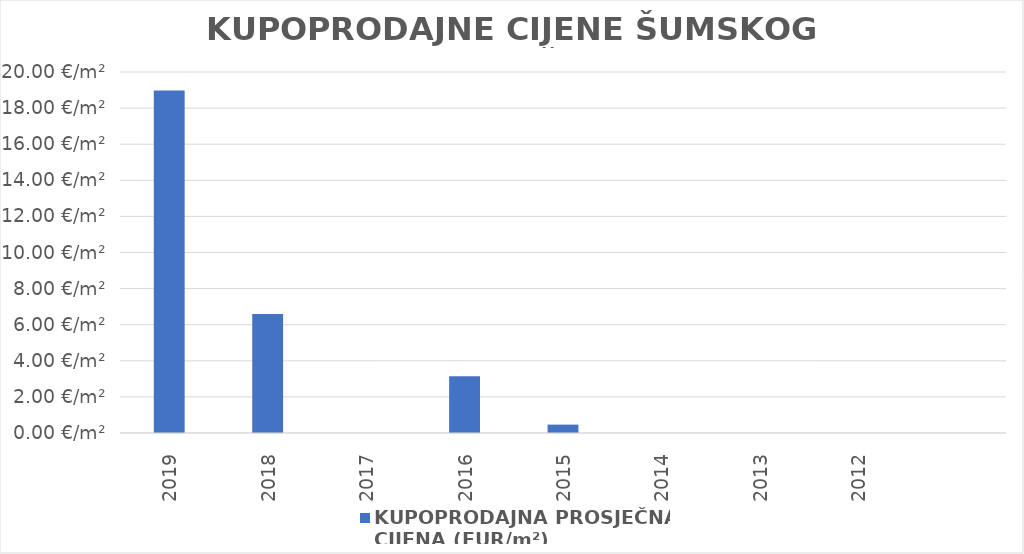
| Category | KUPOPRODAJNA PROSJEČNA 
CIJENA (EUR/m²) |
|---|---|
| 2019 | 1900-01-18 23:16:41 |
| 2018 | 1900-01-06 14:10:46 |
| 2017 | 0 |
| 2016 | 1900-01-03 03:19:32 |
| 2015 | 0.464 |
| 2014 | 0 |
| 2013 | 0 |
| 2012 | 0 |